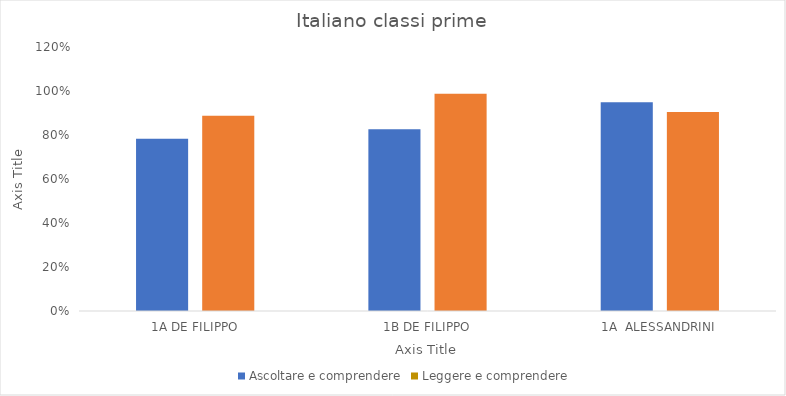
| Category | Ascoltare e comprendere | Leggere e comprendere |
|---|---|---|
| 1A DE FILIPPO | 0.783 | 0.888 |
| 1B DE FILIPPO | 0.826 | 0.987 |
| 1A  ALESSANDRINI | 0.949 | 0.904 |